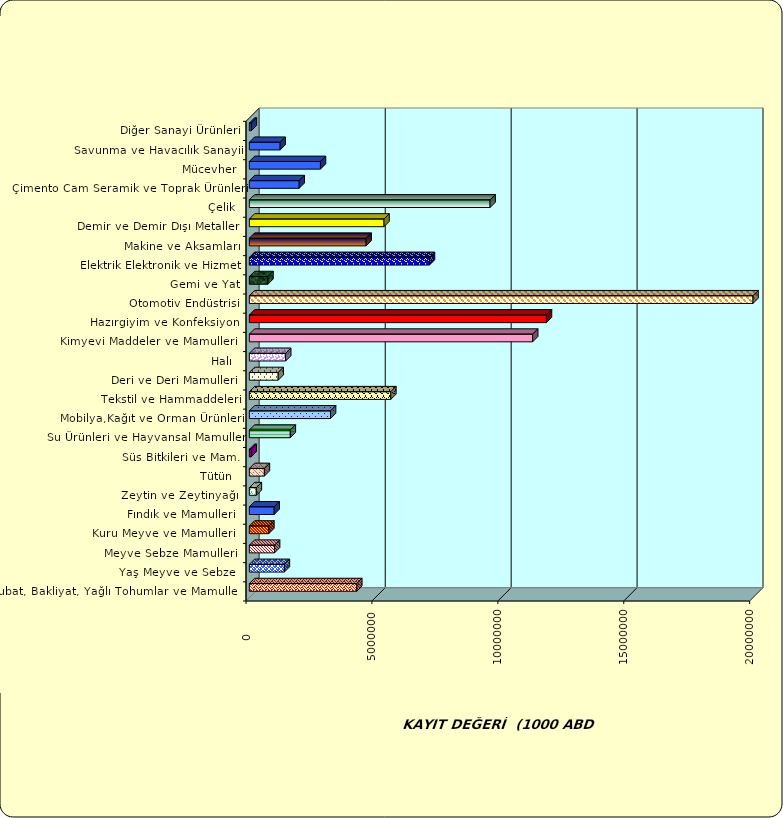
| Category | Series 0 |
|---|---|
|  Hububat, Bakliyat, Yağlı Tohumlar ve Mamulleri  | 4265895.702 |
|  Yaş Meyve ve Sebze   | 1390381.991 |
|  Meyve Sebze Mamulleri  | 1001390.745 |
|  Kuru Meyve ve Mamulleri   | 773187.264 |
|  Fındık ve Mamulleri  | 985181.781 |
|  Zeytin ve Zeytinyağı  | 277064.767 |
|  Tütün  | 596677.494 |
|  Süs Bitkileri ve Mam. | 74050.529 |
|  Su Ürünleri ve Hayvansal Mamuller | 1626148.517 |
|  Mobilya,Kağıt ve Orman Ürünleri | 3222863.615 |
|  Tekstil ve Hammaddeleri | 5618015.206 |
|  Deri ve Deri Mamulleri  | 1145314.632 |
|  Halı  | 1441912.638 |
|  Kimyevi Maddeler ve Mamulleri   | 11250100.571 |
|  Hazırgiyim ve Konfeksiyon  | 11797288.406 |
|  Otomotiv Endüstrisi | 20808307.041 |
|  Gemi ve Yat | 738586.099 |
|  Elektrik Elektronik ve Hizmet | 7151903.416 |
|  Makine ve Aksamları | 4637262.12 |
|  Demir ve Demir Dışı Metaller  | 5346325.465 |
|  Çelik | 9560025.728 |
|  Çimento Cam Seramik ve Toprak Ürünleri | 1979151.789 |
|  Mücevher | 2823562.84 |
|  Savunma ve Havacılık Sanayii | 1224441.829 |
|  Diğer Sanayi Ürünleri | 77493.664 |